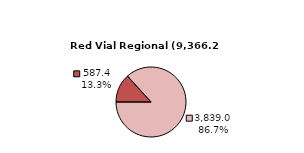
| Category | RV Departamental |
|---|---|
| Pavimentada | 587.431 |
| No Pavimentada | 3838.967 |